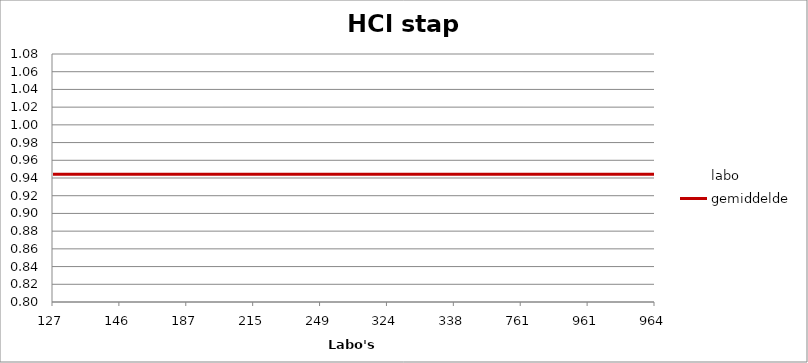
| Category | labo | gemiddelde |
|---|---|---|
| 127.0 | 0.85 | 0.944 |
| 146.0 | 0.95 | 0.944 |
| 187.0 | 0.962 | 0.944 |
| 215.0 | 0.962 | 0.944 |
| 249.0 | 0.857 | 0.944 |
| 324.0 | 0.932 | 0.944 |
| 338.0 | 1.053 | 0.944 |
| 761.0 | 0.902 | 0.944 |
| 961.0 | 1.037 | 0.944 |
| 964.0 | 0.94 | 0.944 |